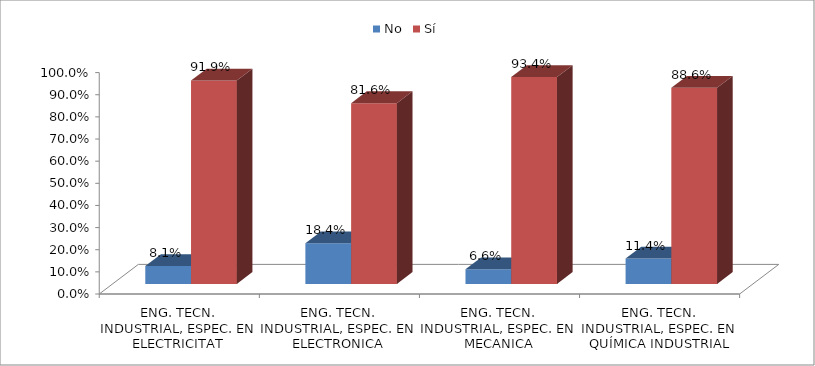
| Category | No | Sí |
|---|---|---|
| ENG. TECN. INDUSTRIAL, ESPEC. EN ELECTRICITAT | 0.081 | 0.919 |
| ENG. TECN. INDUSTRIAL, ESPEC. EN ELECTRONICA INDUSTRIAL | 0.184 | 0.816 |
| ENG. TECN. INDUSTRIAL, ESPEC. EN MECANICA | 0.066 | 0.934 |
| ENG. TECN. INDUSTRIAL, ESPEC. EN QUÍMICA INDUSTRIAL | 0.114 | 0.886 |